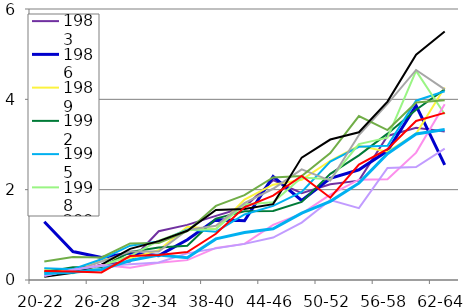
| Category | 1983 | 1986 | 1989 | 1992 | 1995 | 1998 | 2001 | 2004 | 2007 | 2010 | 2013 | 2016 | 2019 |
|---|---|---|---|---|---|---|---|---|---|---|---|---|---|
| 20-22 | 0.18 | 1.29 | 0.25 | 0.18 | 0.26 | 0.18 | 0.13 | 0.41 | 0.07 | 0.1 | 0.09 | 0.144 | 0.2 |
| 23-25 | 0.16 | 0.63 | 0.16 | 0.28 | 0.24 | 0.15 | 0.18 | 0.51 | 0.16 | 0.22 | 0.23 | 0.17 | 0.187 |
| 26-28 | 0.34 | 0.5 | 0.46 | 0.28 | 0.46 | 0.32 | 0.41 | 0.5 | 0.34 | 0.33 | 0.31 | 0.232 | 0.168 |
| 29-31 | 0.41 | 0.6 | 0.48 | 0.62 | 0.76 | 0.53 | 0.63 | 0.81 | 0.69 | 0.27 | 0.35 | 0.432 | 0.53 |
| 32-34 | 1.08 | 0.54 | 0.66 | 0.72 | 0.85 | 0.87 | 0.63 | 0.82 | 0.86 | 0.38 | 0.39 | 0.551 | 0.554 |
| 35-37 | 1.22 | 0.89 | 1.18 | 0.76 | 1.12 | 1.1 | 1.11 | 1.08 | 1.09 | 0.44 | 0.59 | 0.494 | 0.618 |
| 38-40 | 1.42 | 1.34 | 1.13 | 1.36 | 1.07 | 1.13 | 1.2 | 1.64 | 1.55 | 0.71 | 0.7 | 0.91 | 1.025 |
| 41-43 | 1.61 | 1.31 | 1.78 | 1.52 | 1.45 | 1.67 | 1.7 | 1.88 | 1.57 | 0.8 | 0.8 | 1.05 | 1.609 |
| 44-46 | 2.21 | 2.29 | 2.11 | 1.53 | 1.64 | 1.72 | 2.02 | 2.27 | 1.68 | 1.22 | 0.94 | 1.135 | 1.869 |
| 47-49 | 1.92 | 1.76 | 2.22 | 1.73 | 1.95 | 2.27 | 2.45 | 2.3 | 2.71 | 1.47 | 1.27 | 1.481 | 2.303 |
| 50-52 | 2.12 | 2.25 | 2.64 | 2.35 | 2.62 | 2.23 | 2.2 | 2.81 | 3.11 | 1.89 | 1.77 | 1.742 | 1.823 |
| 53-55 | 2.2 | 2.44 | 2.97 | 2.76 | 2.95 | 3.01 | 3.21 | 3.63 | 3.27 | 2.22 | 1.59 | 2.144 | 2.555 |
| 56-58 | 3.19 | 2.86 | 2.84 | 3.24 | 2.97 | 3.15 | 3.9 | 3.32 | 3.95 | 2.23 | 2.48 | 2.797 | 2.896 |
| 59-61 | 3.37 | 3.86 | 3.24 | 3.77 | 3.97 | 4.63 | 4.65 | 3.93 | 4.99 | 2.82 | 2.5 | 3.232 | 3.521 |
| 62-64 | 3.29 | 2.55 | 4.26 | 4.22 | 4.18 | 3.67 | 4.22 | 3.98 | 5.5 | 3.89 | 2.91 | 3.333 | 3.7 |